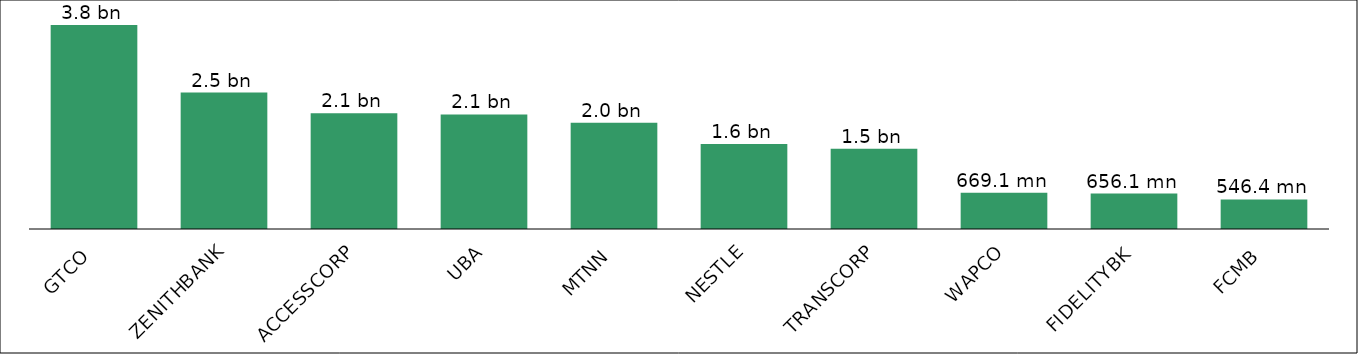
| Category | Series 0 |
|---|---|
| GTCO | 3778531932.95 |
| ZENITHBANK | 2525470734.45 |
| ACCESSCORP | 2144432463.35 |
| UBA | 2122372543 |
| MTNN | 1965330591.15 |
| NESTLE | 1575775911.74 |
| TRANSCORP | 1485360659.8 |
| WAPCO | 669060083.9 |
| FIDELITYBK | 656141889.6 |
| FCMB | 546387308.85 |